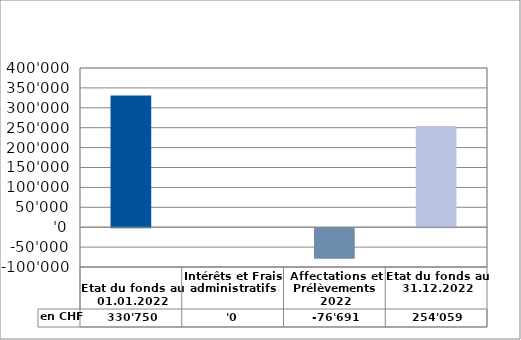
| Category | en CHF |
|---|---|
| 
Etat du fonds au 01.01.2022

 | 330750 |
| Intérêts et Frais administratifs | 0 |
| Affectations et Prélèvements 2022 | -76691 |
| Etat du fonds au 31.12.2022 | 254059 |